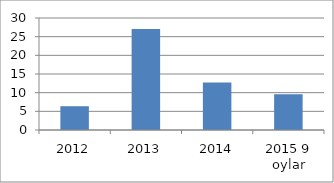
| Category | Series 0 |
|---|---|
| 2012 | 6.37 |
| 2013 | 27.05 |
| 2014 | 12.7 |
| 2015 9 oylar | 9.6 |